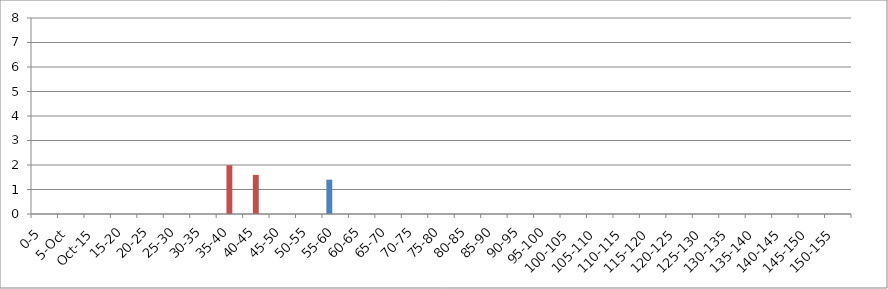
| Category | 119875 | 146067 | 241240 |
|---|---|---|---|
| 0-5 | 0 | 0 | 0 |
| 5.Oct | 0 | 0 | 0 |
| Oct.15 | 0 | 0 | 0 |
| 15-20 | 0 | 0 | 0 |
| 20-25 | 0 | 0 | 0 |
| 25-30 | 0 | 0 | 0 |
| 30-35 | 0 | 0 | 0 |
| 35-40 | 0 | 1.988 | 0 |
| 40-45 | 0 | 1.598 | 0 |
| 45-50 | 0 | 0 | 0 |
| 50-55 | 0 | 0 | 0 |
| 55-60 | 1.401 | 0 | 0 |
| 60-65 | 0 | 0 | 0 |
| 65-70 | 0 | 0 | 0 |
| 70-75 | 0 | 0 | 0 |
| 75-80 | 0 | 0 | 0 |
| 80-85 | 0 | 0 | 0 |
| 85-90 | 0 | 0 | 0 |
| 90-95 | 0 | 0 | 0 |
| 95-100 | 0 | 0 | 0 |
| 100-105 | 0 | 0 | 0 |
| 105-110 | 0 | 0 | 0 |
| 110-115 | 0 | 0 | 0 |
| 115-120 | 0 | 0 | 0 |
| 120-125 | 0 | 0 | 0 |
| 125-130 | 0 | 0 | 0 |
| 130-135 | 0 | 0 | 0 |
| 135-140 | 0 | 0 | 0 |
| 140-145 | 0 | 0 | 0 |
| 145-150 | 0 | 0 | 0 |
| 150-155 | 0 | 0 | 0 |